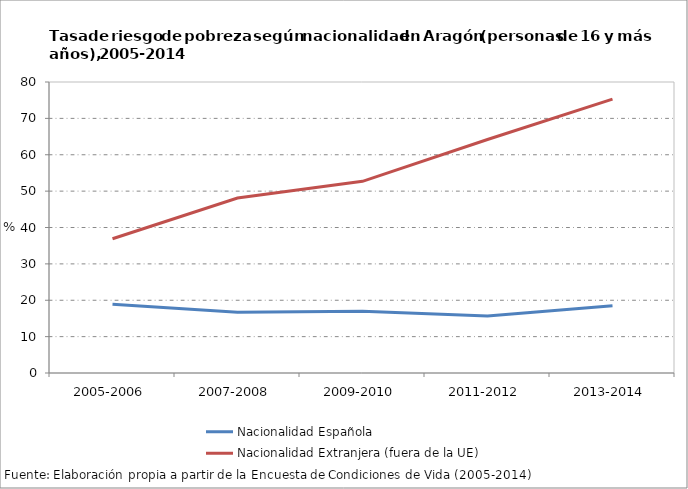
| Category | Nacionalidad Española | Nacionalidad Extranjera (fuera de la UE) |
|---|---|---|
| 2005-2006 | 18.9 | 36.9 |
| 2007-2008 | 16.7 | 48.1 |
| 2009-2010 | 17 | 52.7 |
| 2011-2012 | 15.7 | 64.2 |
| 2013-2014 | 18.5 | 75.3 |